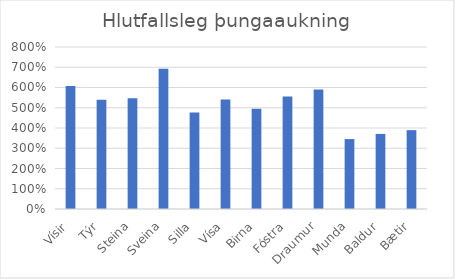
| Category | Series 0 |
|---|---|
| Vísir | 6.075 |
| Týr | 5.395 |
| Steina | 5.471 |
| Sveina | 6.931 |
| Silla | 4.769 |
| Vísa | 5.41 |
| Birna | 4.952 |
| Fóstra | 5.559 |
| Draumur | 5.907 |
| Munda | 3.453 |
| Baldur | 3.708 |
| Bætir | 3.894 |